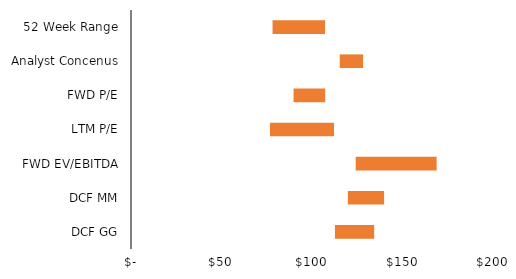
| Category | Q1 | Spread | Q3 |
|---|---|---|---|
| DCF GG | 112.354 | 21.758 | 134.111 |
| DCF MM | 119.477 | 20.08 | 139.557 |
| FWD EV/EBITDA | 123.798 | 44.684 | 168.482 |
| LTM P/E | 76.569 | 35.363 | 111.932 |
| FWD P/E | 89.567 | 17.562 | 107.129 |
| Analyst Concenus | 115 | 13 | 128 |
| 52 Week Range | 78 | 29 | 107 |